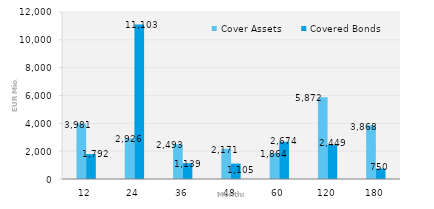
| Category | Cover Assets | Covered Bonds |
|---|---|---|
| 12.0 | 3980.949 | 1792 |
| 24.0 | 2926.303 | 11103 |
| 36.0 | 2492.526 | 1139 |
| 48.0 | 2170.829 | 1105 |
| 60.0 | 1864.465 | 2674 |
| 120.0 | 5871.798 | 2448.5 |
| 180.0 | 3867.505 | 750 |